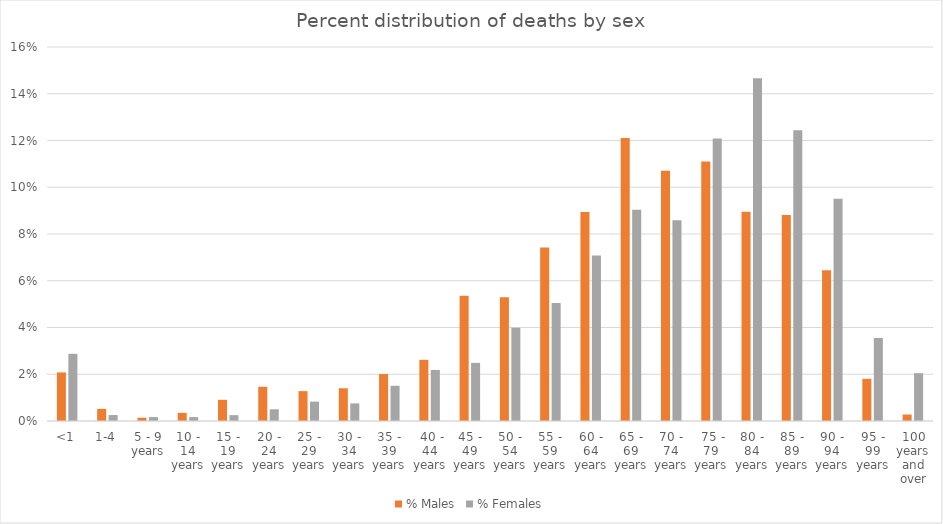
| Category | % Males | % Females |
|---|---|---|
| <1 | 0.021 | 0.029 |
| 1-4 | 0.005 | 0.003 |
| 5 - 9 years | 0.001 | 0.002 |
| 10 - 14 years | 0.003 | 0.002 |
| 15 - 19 years | 0.009 | 0.003 |
| 20 - 24 years | 0.015 | 0.005 |
| 25 - 29 years | 0.013 | 0.008 |
| 30 - 34 years | 0.014 | 0.008 |
| 35 - 39 years | 0.02 | 0.015 |
|  40 - 44 years | 0.026 | 0.022 |
| 45 - 49 years | 0.054 | 0.025 |
| 50 - 54 years | 0.053 | 0.04 |
| 55 - 59 years | 0.074 | 0.05 |
| 60 - 64 years | 0.089 | 0.071 |
| 65 - 69 years | 0.121 | 0.09 |
| 70 - 74 years | 0.107 | 0.086 |
|  75 - 79 years | 0.111 | 0.121 |
| 80 - 84 years | 0.09 | 0.147 |
| 85 - 89 years | 0.088 | 0.124 |
| 90 - 94 years | 0.065 | 0.095 |
| 95 - 99 years | 0.018 | 0.036 |
| 100 years and over | 0.003 | 0.02 |